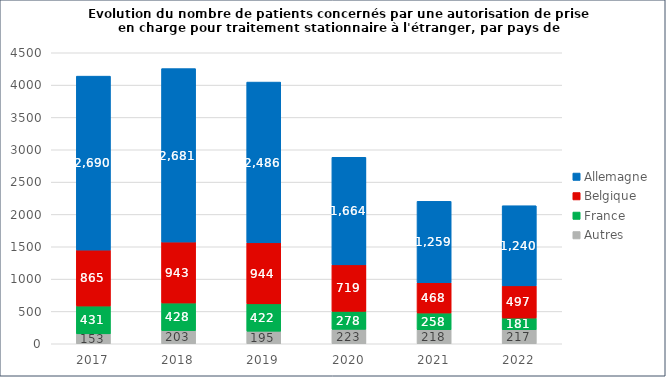
| Category | Autres | France | Belgique | Allemagne |
|---|---|---|---|---|
| 2017.0 | 153 | 431 | 865 | 2690 |
| 2018.0 | 203 | 428 | 943 | 2681 |
| 2019.0 | 195 | 422 | 944 | 2486 |
| 2020.0 | 223 | 278 | 719 | 1664 |
| 2021.0 | 218 | 258 | 468 | 1259 |
| 2022.0 | 217 | 181 | 497 | 1240 |